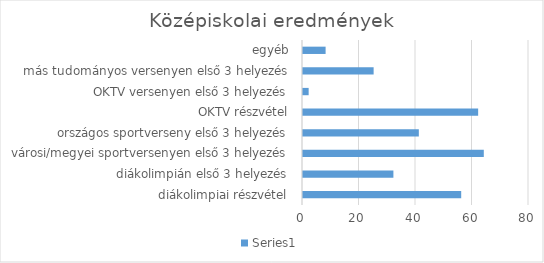
| Category | Series 0 |
|---|---|
| diákolimpiai részvétel | 56 |
| diákolimpián első 3 helyezés | 32 |
| városi/megyei sportversenyen első 3 helyezés | 64 |
| országos sportverseny első 3 helyezés | 41 |
| OKTV részvétel | 62 |
| OKTV versenyen első 3 helyezés | 2 |
| más tudományos versenyen első 3 helyezés | 25 |
| egyéb | 8 |